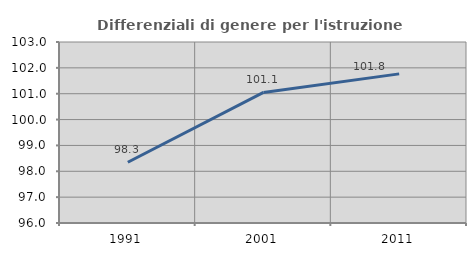
| Category | Differenziali di genere per l'istruzione superiore |
|---|---|
| 1991.0 | 98.349 |
| 2001.0 | 101.05 |
| 2011.0 | 101.767 |